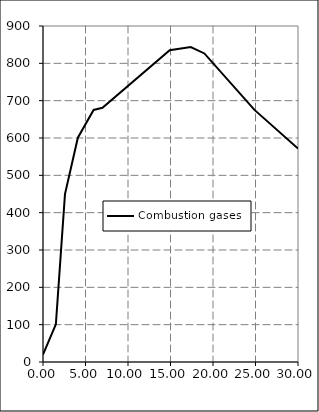
| Category | Combustion gases |
|---|---|
| 0.0 | 20 |
| 1.512953995157385 | 100.807 |
| 2.585593220338983 | 449.635 |
| 4.10139225181598 | 600.786 |
| 5.9532687651331715 | 675.258 |
| 6.9955205811138015 | 680.851 |
| 14.905447941888621 | 834.982 |
| 17.37778450363196 | 843.516 |
| 18.986319612590798 | 826.448 |
| 24.8794794188862 | 675.258 |
| 30.0 | 571.649 |